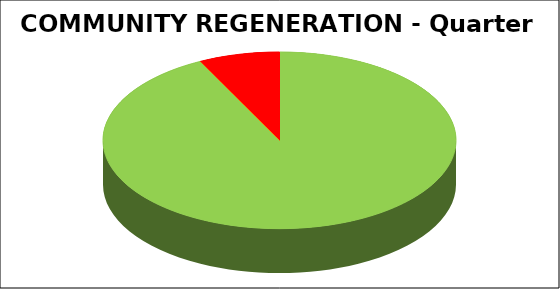
| Category | Series 0 |
|---|---|
| Green | 0.926 |
| Amber | 0 |
| Red | 0.074 |